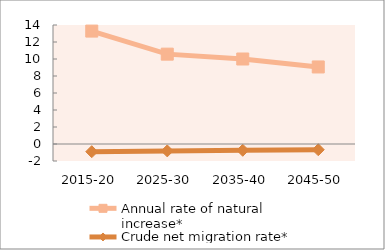
| Category | Annual rate of natural increase* | Crude net migration rate* |
|---|---|---|
| 2015-20 | 13.284 | -0.905 |
| 2025-30 | 10.571 | -0.811 |
| 2035-40 | 10 | -0.738 |
| 2045-50 | 9.064 | -0.675 |